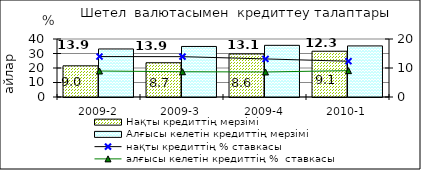
| Category | Нақты кредиттің мерзімі  | Алғысы келетін кредиттің мерзімі  |
|---|---|---|
| 2009-2 | 21.5 | 33.13 |
| 2009-3 | 23.63 | 34.85 |
| 2009-4 | 29.73 | 35.63 |
| 2010-1 | 31.57 | 35.23 |